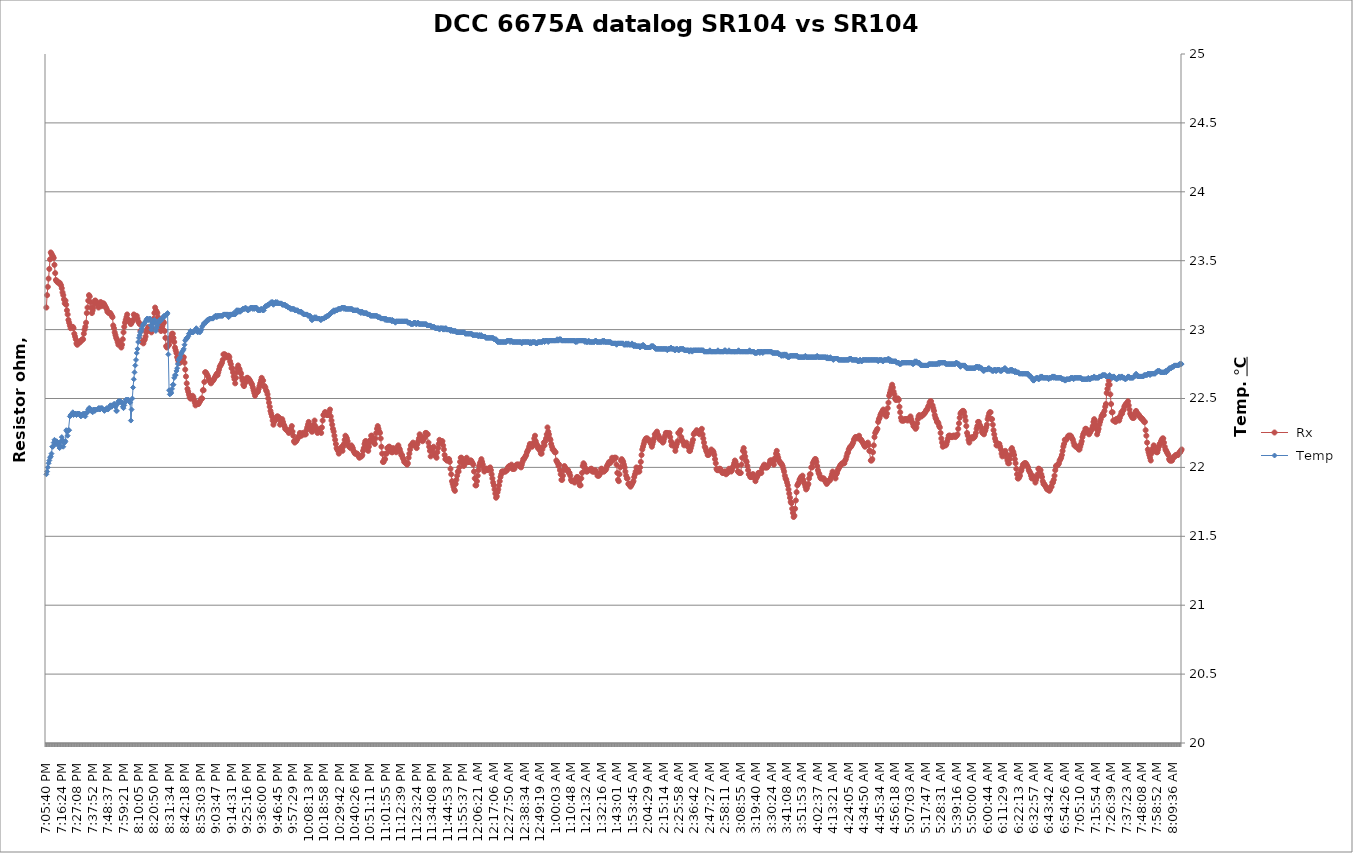
| Category |  Rx |
|---|---|
| 2021-03-24 19:05:40 | 10000.011 |
| 2021-03-24 19:06:10 | 10000.011 |
| 2021-03-24 19:06:41 | 10000.011 |
| 2021-03-24 19:07:12 | 10000.011 |
| 2021-03-24 19:07:42 | 10000.011 |
| 2021-03-24 19:08:13 | 10000.012 |
| 2021-03-24 19:08:44 | 10000.012 |
| 2021-03-24 19:09:14 | 10000.012 |
| 2021-03-24 19:09:45 | 10000.012 |
| 2021-03-24 19:10:16 | 10000.012 |
| 2021-03-24 19:10:46 | 10000.012 |
| 2021-03-24 19:11:17 | 10000.011 |
| 2021-03-24 19:11:48 | 10000.011 |
| 2021-03-24 19:12:18 | 10000.011 |
| 2021-03-24 19:12:49 | 10000.011 |
| 2021-03-24 19:13:20 | 10000.011 |
| 2021-03-24 19:13:51 | 10000.011 |
| 2021-03-24 19:14:21 | 10000.011 |
| 2021-03-24 19:14:52 | 10000.011 |
| 2021-03-24 19:15:23 | 10000.011 |
| 2021-03-24 19:15:53 | 10000.011 |
| 2021-03-24 19:16:24 | 10000.011 |
| 2021-03-24 19:16:55 | 10000.011 |
| 2021-03-24 19:17:25 | 10000.011 |
| 2021-03-24 19:17:56 | 10000.011 |
| 2021-03-24 19:18:27 | 10000.011 |
| 2021-03-24 19:18:57 | 10000.011 |
| 2021-03-24 19:19:28 | 10000.011 |
| 2021-03-24 19:19:59 | 10000.011 |
| 2021-03-24 19:20:29 | 10000.011 |
| 2021-03-24 19:21:00 | 10000.011 |
| 2021-03-24 19:21:31 | 10000.011 |
| 2021-03-24 19:22:01 | 10000.011 |
| 2021-03-24 19:22:32 | 10000.011 |
| 2021-03-24 19:23:03 | 10000.011 |
| 2021-03-24 19:23:33 | 10000.011 |
| 2021-03-24 19:24:04 | 10000.011 |
| 2021-03-24 19:24:35 | 10000.011 |
| 2021-03-24 19:25:05 | 10000.011 |
| 2021-03-24 19:25:36 | 10000.011 |
| 2021-03-24 19:26:07 | 10000.011 |
| 2021-03-24 19:26:37 | 10000.011 |
| 2021-03-24 19:27:08 | 10000.011 |
| 2021-03-24 19:27:39 | 10000.011 |
| 2021-03-24 19:28:10 | 10000.011 |
| 2021-03-24 19:28:40 | 10000.011 |
| 2021-03-24 19:29:11 | 10000.011 |
| 2021-03-24 19:29:42 | 10000.011 |
| 2021-03-24 19:30:12 | 10000.011 |
| 2021-03-24 19:30:43 | 10000.011 |
| 2021-03-24 19:31:14 | 10000.011 |
| 2021-03-24 19:31:44 | 10000.011 |
| 2021-03-24 19:32:15 | 10000.011 |
| 2021-03-24 19:32:46 | 10000.011 |
| 2021-03-24 19:33:16 | 10000.011 |
| 2021-03-24 19:33:47 | 10000.011 |
| 2021-03-24 19:34:18 | 10000.011 |
| 2021-03-24 19:34:48 | 10000.011 |
| 2021-03-24 19:35:19 | 10000.011 |
| 2021-03-24 19:35:50 | 10000.011 |
| 2021-03-24 19:36:20 | 10000.011 |
| 2021-03-24 19:36:51 | 10000.011 |
| 2021-03-24 19:37:22 | 10000.011 |
| 2021-03-24 19:37:52 | 10000.011 |
| 2021-03-24 19:38:23 | 10000.011 |
| 2021-03-24 19:38:54 | 10000.011 |
| 2021-03-24 19:39:24 | 10000.011 |
| 2021-03-24 19:39:55 | 10000.011 |
| 2021-03-24 19:40:26 | 10000.011 |
| 2021-03-24 19:40:57 | 10000.011 |
| 2021-03-24 19:41:27 | 10000.011 |
| 2021-03-24 19:41:58 | 10000.011 |
| 2021-03-24 19:42:29 | 10000.011 |
| 2021-03-24 19:42:59 | 10000.011 |
| 2021-03-24 19:43:30 | 10000.011 |
| 2021-03-24 19:44:01 | 10000.011 |
| 2021-03-24 19:44:31 | 10000.011 |
| 2021-03-24 19:45:02 | 10000.011 |
| 2021-03-24 19:45:33 | 10000.011 |
| 2021-03-24 19:46:03 | 10000.011 |
| 2021-03-24 19:46:34 | 10000.011 |
| 2021-03-24 19:47:05 | 10000.011 |
| 2021-03-24 19:47:35 | 10000.011 |
| 2021-03-24 19:48:06 | 10000.011 |
| 2021-03-24 19:48:37 | 10000.011 |
| 2021-03-24 19:49:07 | 10000.011 |
| 2021-03-24 19:49:38 | 10000.011 |
| 2021-03-24 19:50:09 | 10000.011 |
| 2021-03-24 19:50:39 | 10000.011 |
| 2021-03-24 19:51:10 | 10000.011 |
| 2021-03-24 19:51:41 | 10000.011 |
| 2021-03-24 19:52:11 | 10000.011 |
| 2021-03-24 19:52:42 | 10000.011 |
| 2021-03-24 19:53:13 | 10000.011 |
| 2021-03-24 19:53:44 | 10000.011 |
| 2021-03-24 19:54:14 | 10000.011 |
| 2021-03-24 19:54:45 | 10000.011 |
| 2021-03-24 19:55:16 | 10000.011 |
| 2021-03-24 19:55:46 | 10000.011 |
| 2021-03-24 19:56:17 | 10000.011 |
| 2021-03-24 19:56:48 | 10000.011 |
| 2021-03-24 19:57:18 | 10000.011 |
| 2021-03-24 19:57:49 | 10000.011 |
| 2021-03-24 19:58:20 | 10000.011 |
| 2021-03-24 19:58:50 | 10000.011 |
| 2021-03-24 19:59:21 | 10000.011 |
| 2021-03-24 19:59:52 | 10000.011 |
| 2021-03-24 20:00:22 | 10000.011 |
| 2021-03-24 20:00:53 | 10000.011 |
| 2021-03-24 20:01:24 | 10000.011 |
| 2021-03-24 20:01:54 | 10000.011 |
| 2021-03-24 20:02:25 | 10000.011 |
| 2021-03-24 20:02:56 | 10000.011 |
| 2021-03-24 20:03:26 | 10000.011 |
| 2021-03-24 20:03:57 | 10000.011 |
| 2021-03-24 20:04:28 | 10000.011 |
| 2021-03-24 20:04:58 | 10000.011 |
| 2021-03-24 20:05:29 | 10000.011 |
| 2021-03-24 20:06:00 | 10000.011 |
| 2021-03-24 20:06:30 | 10000.011 |
| 2021-03-24 20:07:01 | 10000.011 |
| 2021-03-24 20:07:32 | 10000.011 |
| 2021-03-24 20:08:03 | 10000.011 |
| 2021-03-24 20:08:33 | 10000.011 |
| 2021-03-24 20:09:04 | 10000.011 |
| 2021-03-24 20:09:35 | 10000.011 |
| 2021-03-24 20:10:05 | 10000.011 |
| 2021-03-24 20:10:36 | 10000.011 |
| 2021-03-24 20:11:07 | 10000.011 |
| 2021-03-24 20:11:37 | 10000.011 |
| 2021-03-24 20:12:08 | 10000.011 |
| 2021-03-24 20:12:39 | 10000.011 |
| 2021-03-24 20:13:09 | 10000.011 |
| 2021-03-24 20:13:40 | 10000.011 |
| 2021-03-24 20:14:11 | 10000.011 |
| 2021-03-24 20:14:41 | 10000.011 |
| 2021-03-24 20:15:12 | 10000.011 |
| 2021-03-24 20:15:43 | 10000.011 |
| 2021-03-24 20:16:13 | 10000.011 |
| 2021-03-24 20:16:44 | 10000.011 |
| 2021-03-24 20:17:15 | 10000.011 |
| 2021-03-24 20:17:45 | 10000.011 |
| 2021-03-24 20:18:16 | 10000.011 |
| 2021-03-24 20:18:47 | 10000.011 |
| 2021-03-24 20:19:18 | 10000.011 |
| 2021-03-24 20:19:48 | 10000.011 |
| 2021-03-24 20:20:19 | 10000.011 |
| 2021-03-24 20:20:50 | 10000.011 |
| 2021-03-24 20:21:20 | 10000.011 |
| 2021-03-24 20:21:51 | 10000.011 |
| 2021-03-24 20:22:22 | 10000.011 |
| 2021-03-24 20:22:52 | 10000.011 |
| 2021-03-24 20:23:23 | 10000.011 |
| 2021-03-24 20:23:54 | 10000.011 |
| 2021-03-24 20:24:24 | 10000.011 |
| 2021-03-24 20:24:55 | 10000.011 |
| 2021-03-24 20:25:26 | 10000.011 |
| 2021-03-24 20:25:56 | 10000.011 |
| 2021-03-24 20:26:27 | 10000.011 |
| 2021-03-24 20:26:58 | 10000.011 |
| 2021-03-24 20:27:29 | 10000.011 |
| 2021-03-24 20:27:59 | 10000.011 |
| 2021-03-24 20:28:30 | 10000.011 |
| 2021-03-24 20:29:01 | 10000.011 |
| 2021-03-24 20:29:31 | 10000.011 |
| 2021-03-24 20:30:02 | 10000.011 |
| 2021-03-24 20:30:33 | 10000.011 |
| 2021-03-24 20:31:03 | 10000.011 |
| 2021-03-24 20:31:34 | 10000.011 |
| 2021-03-24 20:32:05 | 10000.011 |
| 2021-03-24 20:32:35 | 10000.011 |
| 2021-03-24 20:33:06 | 10000.011 |
| 2021-03-24 20:33:37 | 10000.011 |
| 2021-03-24 20:34:07 | 10000.011 |
| 2021-03-24 20:34:38 | 10000.011 |
| 2021-03-24 20:35:09 | 10000.011 |
| 2021-03-24 20:35:39 | 10000.011 |
| 2021-03-24 20:36:10 | 10000.011 |
| 2021-03-24 20:36:41 | 10000.011 |
| 2021-03-24 20:37:11 | 10000.011 |
| 2021-03-24 20:37:42 | 10000.011 |
| 2021-03-24 20:38:13 | 10000.011 |
| 2021-03-24 20:38:44 | 10000.011 |
| 2021-03-24 20:39:14 | 10000.011 |
| 2021-03-24 20:39:45 | 10000.011 |
| 2021-03-24 20:40:16 | 10000.011 |
| 2021-03-24 20:40:46 | 10000.011 |
| 2021-03-24 20:41:17 | 10000.011 |
| 2021-03-24 20:41:48 | 10000.011 |
| 2021-03-24 20:42:18 | 10000.011 |
| 2021-03-24 20:42:49 | 10000.011 |
| 2021-03-24 20:43:20 | 10000.011 |
| 2021-03-24 20:43:50 | 10000.011 |
| 2021-03-24 20:44:21 | 10000.011 |
| 2021-03-24 20:44:52 | 10000.011 |
| 2021-03-24 20:45:22 | 10000.011 |
| 2021-03-24 20:45:53 | 10000.01 |
| 2021-03-24 20:46:24 | 10000.01 |
| 2021-03-24 20:46:55 | 10000.011 |
| 2021-03-24 20:47:25 | 10000.011 |
| 2021-03-24 20:47:56 | 10000.011 |
| 2021-03-24 20:48:27 | 10000.01 |
| 2021-03-24 20:48:57 | 10000.01 |
| 2021-03-24 20:49:28 | 10000.01 |
| 2021-03-24 20:49:59 | 10000.01 |
| 2021-03-24 20:50:29 | 10000.01 |
| 2021-03-24 20:51:00 | 10000.01 |
| 2021-03-24 20:51:31 | 10000.01 |
| 2021-03-24 20:52:01 | 10000.01 |
| 2021-03-24 20:52:32 | 10000.01 |
| 2021-03-24 20:53:03 | 10000.01 |
| 2021-03-24 20:53:33 | 10000.01 |
| 2021-03-24 20:54:04 | 10000.01 |
| 2021-03-24 20:54:35 | 10000.011 |
| 2021-03-24 20:55:05 | 10000.011 |
| 2021-03-24 20:55:36 | 10000.011 |
| 2021-03-24 20:56:07 | 10000.011 |
| 2021-03-24 20:56:38 | 10000.011 |
| 2021-03-24 20:57:08 | 10000.011 |
| 2021-03-24 20:57:39 | 10000.011 |
| 2021-03-24 20:58:10 | 10000.011 |
| 2021-03-24 20:58:40 | 10000.011 |
| 2021-03-24 20:59:11 | 10000.011 |
| 2021-03-24 20:59:42 | 10000.011 |
| 2021-03-24 21:00:12 | 10000.011 |
| 2021-03-24 21:00:43 | 10000.011 |
| 2021-03-24 21:01:14 | 10000.011 |
| 2021-03-24 21:01:44 | 10000.011 |
| 2021-03-24 21:02:15 | 10000.011 |
| 2021-03-24 21:02:46 | 10000.011 |
| 2021-03-24 21:03:16 | 10000.011 |
| 2021-03-24 21:03:47 | 10000.011 |
| 2021-03-24 21:04:18 | 10000.011 |
| 2021-03-24 21:04:48 | 10000.011 |
| 2021-03-24 21:05:19 | 10000.011 |
| 2021-03-24 21:05:50 | 10000.011 |
| 2021-03-24 21:06:20 | 10000.011 |
| 2021-03-24 21:06:51 | 10000.011 |
| 2021-03-24 21:07:22 | 10000.011 |
| 2021-03-24 21:07:53 | 10000.011 |
| 2021-03-24 21:08:23 | 10000.011 |
| 2021-03-24 21:08:54 | 10000.011 |
| 2021-03-24 21:09:25 | 10000.011 |
| 2021-03-24 21:09:55 | 10000.011 |
| 2021-03-24 21:10:26 | 10000.011 |
| 2021-03-24 21:10:57 | 10000.011 |
| 2021-03-24 21:11:27 | 10000.011 |
| 2021-03-24 21:11:58 | 10000.011 |
| 2021-03-24 21:12:29 | 10000.011 |
| 2021-03-24 21:12:59 | 10000.011 |
| 2021-03-24 21:13:30 | 10000.011 |
| 2021-03-24 21:14:01 | 10000.011 |
| 2021-03-24 21:14:31 | 10000.011 |
| 2021-03-24 21:15:02 | 10000.011 |
| 2021-03-24 21:15:33 | 10000.011 |
| 2021-03-24 21:16:03 | 10000.011 |
| 2021-03-24 21:16:34 | 10000.011 |
| 2021-03-24 21:17:05 | 10000.011 |
| 2021-03-24 21:17:36 | 10000.011 |
| 2021-03-24 21:18:06 | 10000.011 |
| 2021-03-24 21:18:37 | 10000.011 |
| 2021-03-24 21:19:08 | 10000.011 |
| 2021-03-24 21:19:38 | 10000.011 |
| 2021-03-24 21:20:09 | 10000.011 |
| 2021-03-24 21:20:40 | 10000.011 |
| 2021-03-24 21:21:10 | 10000.011 |
| 2021-03-24 21:21:41 | 10000.011 |
| 2021-03-24 21:22:12 | 10000.011 |
| 2021-03-24 21:22:42 | 10000.011 |
| 2021-03-24 21:23:13 | 10000.011 |
| 2021-03-24 21:23:44 | 10000.011 |
| 2021-03-24 21:24:14 | 10000.011 |
| 2021-03-24 21:24:45 | 10000.011 |
| 2021-03-24 21:25:16 | 10000.011 |
| 2021-03-24 21:25:46 | 10000.011 |
| 2021-03-24 21:26:17 | 10000.011 |
| 2021-03-24 21:26:48 | 10000.011 |
| 2021-03-24 21:27:19 | 10000.011 |
| 2021-03-24 21:27:49 | 10000.011 |
| 2021-03-24 21:28:20 | 10000.011 |
| 2021-03-24 21:28:51 | 10000.011 |
| 2021-03-24 21:29:21 | 10000.011 |
| 2021-03-24 21:29:52 | 10000.011 |
| 2021-03-24 21:30:23 | 10000.011 |
| 2021-03-24 21:30:53 | 10000.011 |
| 2021-03-24 21:31:24 | 10000.011 |
| 2021-03-24 21:31:55 | 10000.011 |
| 2021-03-24 21:32:25 | 10000.011 |
| 2021-03-24 21:32:56 | 10000.011 |
| 2021-03-24 21:33:27 | 10000.011 |
| 2021-03-24 21:33:57 | 10000.011 |
| 2021-03-24 21:34:28 | 10000.011 |
| 2021-03-24 21:34:59 | 10000.011 |
| 2021-03-24 21:35:29 | 10000.011 |
| 2021-03-24 21:36:00 | 10000.011 |
| 2021-03-24 21:36:31 | 10000.011 |
| 2021-03-24 21:37:02 | 10000.011 |
| 2021-03-24 21:37:32 | 10000.011 |
| 2021-03-24 21:38:03 | 10000.011 |
| 2021-03-24 21:38:34 | 10000.011 |
| 2021-03-24 21:39:04 | 10000.011 |
| 2021-03-24 21:39:35 | 10000.011 |
| 2021-03-24 21:40:06 | 10000.01 |
| 2021-03-24 21:40:36 | 10000.01 |
| 2021-03-24 21:41:07 | 10000.01 |
| 2021-03-24 21:41:38 | 10000.01 |
| 2021-03-24 21:42:08 | 10000.01 |
| 2021-03-24 21:42:39 | 10000.01 |
| 2021-03-24 21:43:10 | 10000.01 |
| 2021-03-24 21:43:40 | 10000.01 |
| 2021-03-24 21:44:11 | 10000.01 |
| 2021-03-24 21:44:42 | 10000.01 |
| 2021-03-24 21:45:13 | 10000.01 |
| 2021-03-24 21:45:43 | 10000.01 |
| 2021-03-24 21:46:14 | 10000.01 |
| 2021-03-24 21:46:45 | 10000.01 |
| 2021-03-24 21:47:15 | 10000.01 |
| 2021-03-24 21:47:46 | 10000.01 |
| 2021-03-24 21:48:17 | 10000.01 |
| 2021-03-24 21:48:47 | 10000.01 |
| 2021-03-24 21:49:18 | 10000.01 |
| 2021-03-24 21:49:49 | 10000.01 |
| 2021-03-24 21:50:19 | 10000.01 |
| 2021-03-24 21:50:50 | 10000.01 |
| 2021-03-24 21:51:21 | 10000.01 |
| 2021-03-24 21:51:51 | 10000.01 |
| 2021-03-24 21:52:22 | 10000.01 |
| 2021-03-24 21:52:53 | 10000.01 |
| 2021-03-24 21:53:23 | 10000.01 |
| 2021-03-24 21:53:54 | 10000.01 |
| 2021-03-24 21:54:25 | 10000.01 |
| 2021-03-24 21:54:56 | 10000.01 |
| 2021-03-24 21:55:26 | 10000.01 |
| 2021-03-24 21:55:57 | 10000.01 |
| 2021-03-24 21:56:28 | 10000.01 |
| 2021-03-24 21:56:58 | 10000.01 |
| 2021-03-24 21:57:29 | 10000.01 |
| 2021-03-24 21:58:00 | 10000.01 |
| 2021-03-24 21:58:30 | 10000.01 |
| 2021-03-24 21:59:01 | 10000.01 |
| 2021-03-24 21:59:32 | 10000.01 |
| 2021-03-24 22:00:02 | 10000.01 |
| 2021-03-24 22:00:33 | 10000.01 |
| 2021-03-24 22:01:04 | 10000.01 |
| 2021-03-24 22:01:34 | 10000.01 |
| 2021-03-24 22:02:05 | 10000.01 |
| 2021-03-24 22:02:36 | 10000.01 |
| 2021-03-24 22:03:06 | 10000.01 |
| 2021-03-24 22:03:37 | 10000.01 |
| 2021-03-24 22:04:08 | 10000.01 |
| 2021-03-24 22:04:38 | 10000.01 |
| 2021-03-24 22:05:09 | 10000.01 |
| 2021-03-24 22:05:40 | 10000.01 |
| 2021-03-24 22:06:11 | 10000.01 |
| 2021-03-24 22:06:41 | 10000.01 |
| 2021-03-24 22:07:12 | 10000.01 |
| 2021-03-24 22:07:43 | 10000.01 |
| 2021-03-24 22:08:13 | 10000.01 |
| 2021-03-24 22:08:44 | 10000.01 |
| 2021-03-24 22:09:15 | 10000.01 |
| 2021-03-24 22:09:45 | 10000.01 |
| 2021-03-24 22:10:16 | 10000.01 |
| 2021-03-24 22:10:47 | 10000.01 |
| 2021-03-24 22:11:17 | 10000.01 |
| 2021-03-24 22:11:48 | 10000.01 |
| 2021-03-24 22:12:19 | 10000.01 |
| 2021-03-24 22:12:49 | 10000.01 |
| 2021-03-24 22:13:20 | 10000.01 |
| 2021-03-24 22:13:51 | 10000.01 |
| 2021-03-24 22:14:21 | 10000.01 |
| 2021-03-24 22:14:52 | 10000.01 |
| 2021-03-24 22:15:23 | 10000.01 |
| 2021-03-24 22:15:54 | 10000.01 |
| 2021-03-24 22:16:24 | 10000.01 |
| 2021-03-24 22:16:55 | 10000.01 |
| 2021-03-24 22:17:26 | 10000.01 |
| 2021-03-24 22:17:56 | 10000.01 |
| 2021-03-24 22:18:27 | 10000.01 |
| 2021-03-24 22:18:58 | 10000.01 |
| 2021-03-24 22:19:28 | 10000.01 |
| 2021-03-24 22:19:59 | 10000.01 |
| 2021-03-24 22:20:30 | 10000.01 |
| 2021-03-24 22:21:00 | 10000.01 |
| 2021-03-24 22:21:31 | 10000.01 |
| 2021-03-24 22:22:02 | 10000.01 |
| 2021-03-24 22:22:32 | 10000.01 |
| 2021-03-24 22:23:03 | 10000.01 |
| 2021-03-24 22:23:34 | 10000.01 |
| 2021-03-24 22:24:04 | 10000.01 |
| 2021-03-24 22:24:35 | 10000.01 |
| 2021-03-24 22:25:06 | 10000.01 |
| 2021-03-24 22:25:36 | 10000.01 |
| 2021-03-24 22:26:07 | 10000.01 |
| 2021-03-24 22:26:38 | 10000.01 |
| 2021-03-24 22:27:09 | 10000.01 |
| 2021-03-24 22:27:39 | 10000.01 |
| 2021-03-24 22:28:10 | 10000.01 |
| 2021-03-24 22:28:41 | 10000.01 |
| 2021-03-24 22:29:11 | 10000.01 |
| 2021-03-24 22:29:42 | 10000.01 |
| 2021-03-24 22:30:13 | 10000.01 |
| 2021-03-24 22:30:43 | 10000.01 |
| 2021-03-24 22:31:14 | 10000.01 |
| 2021-03-24 22:31:45 | 10000.01 |
| 2021-03-24 22:32:15 | 10000.01 |
| 2021-03-24 22:32:46 | 10000.01 |
| 2021-03-24 22:33:17 | 10000.01 |
| 2021-03-24 22:33:47 | 10000.01 |
| 2021-03-24 22:34:18 | 10000.01 |
| 2021-03-24 22:34:49 | 10000.01 |
| 2021-03-24 22:35:20 | 10000.01 |
| 2021-03-24 22:35:50 | 10000.01 |
| 2021-03-24 22:36:21 | 10000.01 |
| 2021-03-24 22:36:52 | 10000.01 |
| 2021-03-24 22:37:22 | 10000.01 |
| 2021-03-24 22:37:53 | 10000.01 |
| 2021-03-24 22:38:24 | 10000.01 |
| 2021-03-24 22:38:54 | 10000.01 |
| 2021-03-24 22:39:25 | 10000.01 |
| 2021-03-24 22:39:56 | 10000.01 |
| 2021-03-24 22:40:26 | 10000.01 |
| 2021-03-24 22:40:57 | 10000.01 |
| 2021-03-24 22:41:28 | 10000.01 |
| 2021-03-24 22:41:58 | 10000.01 |
| 2021-03-24 22:42:29 | 10000.01 |
| 2021-03-24 22:43:00 | 10000.01 |
| 2021-03-24 22:43:30 | 10000.01 |
| 2021-03-24 22:44:01 | 10000.01 |
| 2021-03-24 22:44:32 | 10000.01 |
| 2021-03-24 22:45:03 | 10000.01 |
| 2021-03-24 22:45:33 | 10000.01 |
| 2021-03-24 22:46:04 | 10000.01 |
| 2021-03-24 22:46:35 | 10000.01 |
| 2021-03-24 22:47:05 | 10000.01 |
| 2021-03-24 22:47:36 | 10000.01 |
| 2021-03-24 22:48:07 | 10000.01 |
| 2021-03-24 22:48:37 | 10000.01 |
| 2021-03-24 22:49:08 | 10000.01 |
| 2021-03-24 22:49:39 | 10000.01 |
| 2021-03-24 22:50:09 | 10000.01 |
| 2021-03-24 22:50:40 | 10000.01 |
| 2021-03-24 22:51:11 | 10000.01 |
| 2021-03-24 22:51:41 | 10000.01 |
| 2021-03-24 22:52:12 | 10000.01 |
| 2021-03-24 22:52:43 | 10000.01 |
| 2021-03-24 22:53:13 | 10000.01 |
| 2021-03-24 22:53:44 | 10000.01 |
| 2021-03-24 22:54:15 | 10000.01 |
| 2021-03-24 22:54:46 | 10000.01 |
| 2021-03-24 22:55:16 | 10000.01 |
| 2021-03-24 22:55:47 | 10000.01 |
| 2021-03-24 22:56:18 | 10000.01 |
| 2021-03-24 22:56:48 | 10000.01 |
| 2021-03-24 22:57:19 | 10000.01 |
| 2021-03-24 22:57:50 | 10000.01 |
| 2021-03-24 22:58:20 | 10000.01 |
| 2021-03-24 22:58:51 | 10000.01 |
| 2021-03-24 22:59:22 | 10000.01 |
| 2021-03-24 22:59:52 | 10000.01 |
| 2021-03-24 23:00:23 | 10000.01 |
| 2021-03-24 23:00:54 | 10000.01 |
| 2021-03-24 23:01:24 | 10000.01 |
| 2021-03-24 23:01:55 | 10000.01 |
| 2021-03-24 23:02:26 | 10000.01 |
| 2021-03-24 23:02:56 | 10000.01 |
| 2021-03-24 23:03:27 | 10000.01 |
| 2021-03-24 23:03:58 | 10000.01 |
| 2021-03-24 23:04:29 | 10000.01 |
| 2021-03-24 23:04:59 | 10000.01 |
| 2021-03-24 23:05:30 | 10000.01 |
| 2021-03-24 23:06:01 | 10000.01 |
| 2021-03-24 23:06:31 | 10000.01 |
| 2021-03-24 23:07:02 | 10000.01 |
| 2021-03-24 23:07:33 | 10000.01 |
| 2021-03-24 23:08:03 | 10000.01 |
| 2021-03-24 23:08:34 | 10000.01 |
| 2021-03-24 23:09:05 | 10000.01 |
| 2021-03-24 23:09:35 | 10000.01 |
| 2021-03-24 23:10:06 | 10000.01 |
| 2021-03-24 23:10:37 | 10000.01 |
| 2021-03-24 23:11:07 | 10000.01 |
| 2021-03-24 23:11:38 | 10000.01 |
| 2021-03-24 23:12:09 | 10000.01 |
| 2021-03-24 23:12:39 | 10000.01 |
| 2021-03-24 23:13:10 | 10000.01 |
| 2021-03-24 23:13:41 | 10000.01 |
| 2021-03-24 23:14:12 | 10000.01 |
| 2021-03-24 23:14:42 | 10000.01 |
| 2021-03-24 23:15:13 | 10000.01 |
| 2021-03-24 23:15:44 | 10000.01 |
| 2021-03-24 23:16:14 | 10000.01 |
| 2021-03-24 23:16:45 | 10000.01 |
| 2021-03-24 23:17:16 | 10000.01 |
| 2021-03-24 23:17:46 | 10000.01 |
| 2021-03-24 23:18:17 | 10000.01 |
| 2021-03-24 23:18:48 | 10000.01 |
| 2021-03-24 23:19:18 | 10000.01 |
| 2021-03-24 23:19:49 | 10000.01 |
| 2021-03-24 23:20:20 | 10000.01 |
| 2021-03-24 23:20:50 | 10000.01 |
| 2021-03-24 23:21:21 | 10000.01 |
| 2021-03-24 23:21:52 | 10000.01 |
| 2021-03-24 23:22:22 | 10000.01 |
| 2021-03-24 23:22:53 | 10000.01 |
| 2021-03-24 23:23:24 | 10000.01 |
| 2021-03-24 23:23:55 | 10000.01 |
| 2021-03-24 23:24:25 | 10000.01 |
| 2021-03-24 23:24:56 | 10000.01 |
| 2021-03-24 23:25:27 | 10000.01 |
| 2021-03-24 23:25:57 | 10000.01 |
| 2021-03-24 23:26:28 | 10000.01 |
| 2021-03-24 23:26:59 | 10000.01 |
| 2021-03-24 23:27:29 | 10000.01 |
| 2021-03-24 23:28:00 | 10000.01 |
| 2021-03-24 23:28:31 | 10000.01 |
| 2021-03-24 23:29:01 | 10000.01 |
| 2021-03-24 23:29:32 | 10000.01 |
| 2021-03-24 23:30:03 | 10000.01 |
| 2021-03-24 23:30:33 | 10000.01 |
| 2021-03-24 23:31:04 | 10000.01 |
| 2021-03-24 23:31:35 | 10000.01 |
| 2021-03-24 23:32:05 | 10000.01 |
| 2021-03-24 23:32:36 | 10000.01 |
| 2021-03-24 23:33:07 | 10000.01 |
| 2021-03-24 23:33:38 | 10000.01 |
| 2021-03-24 23:34:08 | 10000.01 |
| 2021-03-24 23:34:39 | 10000.01 |
| 2021-03-24 23:35:10 | 10000.01 |
| 2021-03-24 23:35:40 | 10000.01 |
| 2021-03-24 23:36:11 | 10000.01 |
| 2021-03-24 23:36:42 | 10000.01 |
| 2021-03-24 23:37:12 | 10000.01 |
| 2021-03-24 23:37:43 | 10000.01 |
| 2021-03-24 23:38:14 | 10000.01 |
| 2021-03-24 23:38:44 | 10000.01 |
| 2021-03-24 23:39:15 | 10000.01 |
| 2021-03-24 23:39:46 | 10000.01 |
| 2021-03-24 23:40:16 | 10000.01 |
| 2021-03-24 23:40:47 | 10000.01 |
| 2021-03-24 23:41:18 | 10000.01 |
| 2021-03-24 23:41:48 | 10000.01 |
| 2021-03-24 23:42:19 | 10000.01 |
| 2021-03-24 23:42:50 | 10000.01 |
| 2021-03-24 23:43:21 | 10000.01 |
| 2021-03-24 23:43:51 | 10000.01 |
| 2021-03-24 23:44:22 | 10000.01 |
| 2021-03-24 23:44:53 | 10000.01 |
| 2021-03-24 23:45:23 | 10000.01 |
| 2021-03-24 23:45:54 | 10000.01 |
| 2021-03-24 23:46:25 | 10000.01 |
| 2021-03-24 23:46:55 | 10000.01 |
| 2021-03-24 23:47:26 | 10000.01 |
| 2021-03-24 23:47:57 | 10000.01 |
| 2021-03-24 23:48:27 | 10000.01 |
| 2021-03-24 23:48:58 | 10000.01 |
| 2021-03-24 23:49:29 | 10000.01 |
| 2021-03-24 23:49:59 | 10000.01 |
| 2021-03-24 23:50:30 | 10000.01 |
| 2021-03-24 23:51:01 | 10000.01 |
| 2021-03-24 23:51:31 | 10000.01 |
| 2021-03-24 23:52:02 | 10000.01 |
| 2021-03-24 23:52:33 | 10000.01 |
| 2021-03-24 23:53:04 | 10000.01 |
| 2021-03-24 23:53:34 | 10000.01 |
| 2021-03-24 23:54:05 | 10000.01 |
| 2021-03-24 23:54:36 | 10000.01 |
| 2021-03-24 23:55:06 | 10000.01 |
| 2021-03-24 23:55:37 | 10000.01 |
| 2021-03-24 23:56:08 | 10000.01 |
| 2021-03-24 23:56:38 | 10000.01 |
| 2021-03-24 23:57:09 | 10000.01 |
| 2021-03-24 23:57:40 | 10000.01 |
| 2021-03-24 23:58:10 | 10000.01 |
| 2021-03-24 23:58:41 | 10000.01 |
| 2021-03-24 23:59:12 | 10000.01 |
| 2021-03-24 23:59:42 | 10000.01 |
| 2021-03-25 00:00:13 | 10000.01 |
| 2021-03-25 00:00:44 | 10000.01 |
| 2021-03-25 00:01:15 | 10000.01 |
| 2021-03-25 00:01:45 | 10000.01 |
| 2021-03-25 00:02:16 | 10000.01 |
| 2021-03-25 00:02:47 | 10000.01 |
| 2021-03-25 00:03:17 | 10000.01 |
| 2021-03-25 00:03:48 | 10000.01 |
| 2021-03-25 00:04:19 | 10000.01 |
| 2021-03-25 00:04:49 | 10000.01 |
| 2021-03-25 00:05:20 | 10000.01 |
| 2021-03-25 00:05:51 | 10000.01 |
| 2021-03-25 00:06:21 | 10000.01 |
| 2021-03-25 00:06:52 | 10000.01 |
| 2021-03-25 00:07:23 | 10000.01 |
| 2021-03-25 00:07:53 | 10000.01 |
| 2021-03-25 00:08:24 | 10000.01 |
| 2021-03-25 00:08:55 | 10000.01 |
| 2021-03-25 00:09:25 | 10000.01 |
| 2021-03-25 00:09:56 | 10000.01 |
| 2021-03-25 00:10:27 | 10000.01 |
| 2021-03-25 00:10:57 | 10000.01 |
| 2021-03-25 00:11:28 | 10000.01 |
| 2021-03-25 00:11:59 | 10000.01 |
| 2021-03-25 00:12:30 | 10000.01 |
| 2021-03-25 00:13:00 | 10000.01 |
| 2021-03-25 00:13:31 | 10000.01 |
| 2021-03-25 00:14:02 | 10000.01 |
| 2021-03-25 00:14:32 | 10000.01 |
| 2021-03-25 00:15:03 | 10000.01 |
| 2021-03-25 00:15:34 | 10000.01 |
| 2021-03-25 00:16:04 | 10000.01 |
| 2021-03-25 00:16:35 | 10000.01 |
| 2021-03-25 00:17:06 | 10000.01 |
| 2021-03-25 00:17:36 | 10000.01 |
| 2021-03-25 00:18:07 | 10000.01 |
| 2021-03-25 00:18:38 | 10000.01 |
| 2021-03-25 00:19:08 | 10000.01 |
| 2021-03-25 00:19:39 | 10000.01 |
| 2021-03-25 00:20:10 | 10000.01 |
| 2021-03-25 00:20:40 | 10000.01 |
| 2021-03-25 00:21:11 | 10000.01 |
| 2021-03-25 00:21:42 | 10000.01 |
| 2021-03-25 00:22:12 | 10000.01 |
| 2021-03-25 00:22:43 | 10000.01 |
| 2021-03-25 00:23:14 | 10000.01 |
| 2021-03-25 00:23:45 | 10000.01 |
| 2021-03-25 00:24:15 | 10000.01 |
| 2021-03-25 00:24:46 | 10000.01 |
| 2021-03-25 00:25:17 | 10000.01 |
| 2021-03-25 00:25:47 | 10000.01 |
| 2021-03-25 00:26:18 | 10000.01 |
| 2021-03-25 00:26:49 | 10000.01 |
| 2021-03-25 00:27:19 | 10000.01 |
| 2021-03-25 00:27:50 | 10000.01 |
| 2021-03-25 00:28:21 | 10000.01 |
| 2021-03-25 00:28:51 | 10000.01 |
| 2021-03-25 00:29:22 | 10000.01 |
| 2021-03-25 00:29:53 | 10000.01 |
| 2021-03-25 00:30:23 | 10000.01 |
| 2021-03-25 00:30:54 | 10000.01 |
| 2021-03-25 00:31:25 | 10000.01 |
| 2021-03-25 00:31:56 | 10000.01 |
| 2021-03-25 00:32:26 | 10000.01 |
| 2021-03-25 00:32:57 | 10000.01 |
| 2021-03-25 00:33:28 | 10000.01 |
| 2021-03-25 00:33:58 | 10000.01 |
| 2021-03-25 00:34:29 | 10000.01 |
| 2021-03-25 00:35:00 | 10000.01 |
| 2021-03-25 00:35:30 | 10000.01 |
| 2021-03-25 00:36:01 | 10000.01 |
| 2021-03-25 00:36:32 | 10000.01 |
| 2021-03-25 00:37:02 | 10000.01 |
| 2021-03-25 00:37:33 | 10000.01 |
| 2021-03-25 00:38:04 | 10000.01 |
| 2021-03-25 00:38:34 | 10000.01 |
| 2021-03-25 00:39:05 | 10000.01 |
| 2021-03-25 00:39:36 | 10000.01 |
| 2021-03-25 00:40:06 | 10000.01 |
| 2021-03-25 00:40:37 | 10000.01 |
| 2021-03-25 00:41:08 | 10000.01 |
| 2021-03-25 00:41:39 | 10000.01 |
| 2021-03-25 00:42:09 | 10000.01 |
| 2021-03-25 00:42:40 | 10000.01 |
| 2021-03-25 00:43:11 | 10000.01 |
| 2021-03-25 00:43:41 | 10000.01 |
| 2021-03-25 00:44:12 | 10000.01 |
| 2021-03-25 00:44:43 | 10000.01 |
| 2021-03-25 00:45:13 | 10000.01 |
| 2021-03-25 00:45:44 | 10000.01 |
| 2021-03-25 00:46:15 | 10000.01 |
| 2021-03-25 00:46:45 | 10000.01 |
| 2021-03-25 00:47:16 | 10000.01 |
| 2021-03-25 00:47:47 | 10000.01 |
| 2021-03-25 00:48:17 | 10000.01 |
| 2021-03-25 00:48:48 | 10000.01 |
| 2021-03-25 00:49:19 | 10000.01 |
| 2021-03-25 00:49:49 | 10000.01 |
| 2021-03-25 00:50:20 | 10000.01 |
| 2021-03-25 00:50:51 | 10000.01 |
| 2021-03-25 00:51:22 | 10000.01 |
| 2021-03-25 00:51:52 | 10000.01 |
| 2021-03-25 00:52:23 | 10000.01 |
| 2021-03-25 00:52:54 | 10000.01 |
| 2021-03-25 00:53:24 | 10000.01 |
| 2021-03-25 00:53:55 | 10000.01 |
| 2021-03-25 00:54:26 | 10000.01 |
| 2021-03-25 00:54:56 | 10000.01 |
| 2021-03-25 00:55:27 | 10000.01 |
| 2021-03-25 00:55:58 | 10000.01 |
| 2021-03-25 00:56:28 | 10000.01 |
| 2021-03-25 00:56:59 | 10000.01 |
| 2021-03-25 00:57:30 | 10000.01 |
| 2021-03-25 00:58:00 | 10000.01 |
| 2021-03-25 00:58:31 | 10000.01 |
| 2021-03-25 00:59:02 | 10000.01 |
| 2021-03-25 00:59:32 | 10000.01 |
| 2021-03-25 01:00:03 | 10000.01 |
| 2021-03-25 01:00:34 | 10000.01 |
| 2021-03-25 01:01:05 | 10000.01 |
| 2021-03-25 01:01:35 | 10000.01 |
| 2021-03-25 01:02:06 | 10000.01 |
| 2021-03-25 01:02:37 | 10000.01 |
| 2021-03-25 01:03:07 | 10000.01 |
| 2021-03-25 01:03:38 | 10000.01 |
| 2021-03-25 01:04:09 | 10000.01 |
| 2021-03-25 01:04:39 | 10000.01 |
| 2021-03-25 01:05:10 | 10000.01 |
| 2021-03-25 01:05:41 | 10000.01 |
| 2021-03-25 01:06:11 | 10000.01 |
| 2021-03-25 01:06:42 | 10000.01 |
| 2021-03-25 01:07:13 | 10000.01 |
| 2021-03-25 01:07:43 | 10000.01 |
| 2021-03-25 01:08:14 | 10000.01 |
| 2021-03-25 01:08:45 | 10000.01 |
| 2021-03-25 01:09:15 | 10000.01 |
| 2021-03-25 01:09:46 | 10000.01 |
| 2021-03-25 01:10:17 | 10000.01 |
| 2021-03-25 01:10:48 | 10000.01 |
| 2021-03-25 01:11:18 | 10000.01 |
| 2021-03-25 01:11:49 | 10000.01 |
| 2021-03-25 01:12:20 | 10000.01 |
| 2021-03-25 01:12:50 | 10000.01 |
| 2021-03-25 01:13:21 | 10000.01 |
| 2021-03-25 01:13:52 | 10000.01 |
| 2021-03-25 01:14:22 | 10000.01 |
| 2021-03-25 01:14:53 | 10000.01 |
| 2021-03-25 01:15:24 | 10000.01 |
| 2021-03-25 01:15:54 | 10000.01 |
| 2021-03-25 01:16:25 | 10000.01 |
| 2021-03-25 01:16:56 | 10000.01 |
| 2021-03-25 01:17:26 | 10000.01 |
| 2021-03-25 01:17:57 | 10000.01 |
| 2021-03-25 01:18:28 | 10000.01 |
| 2021-03-25 01:18:58 | 10000.01 |
| 2021-03-25 01:19:29 | 10000.01 |
| 2021-03-25 01:20:00 | 10000.01 |
| 2021-03-25 01:20:30 | 10000.01 |
| 2021-03-25 01:21:01 | 10000.01 |
| 2021-03-25 01:21:32 | 10000.01 |
| 2021-03-25 01:22:03 | 10000.01 |
| 2021-03-25 01:22:33 | 10000.01 |
| 2021-03-25 01:23:04 | 10000.01 |
| 2021-03-25 01:23:35 | 10000.01 |
| 2021-03-25 01:24:05 | 10000.01 |
| 2021-03-25 01:24:36 | 10000.01 |
| 2021-03-25 01:25:07 | 10000.01 |
| 2021-03-25 01:25:37 | 10000.01 |
| 2021-03-25 01:26:08 | 10000.01 |
| 2021-03-25 01:26:39 | 10000.01 |
| 2021-03-25 01:27:09 | 10000.01 |
| 2021-03-25 01:27:40 | 10000.01 |
| 2021-03-25 01:28:11 | 10000.01 |
| 2021-03-25 01:28:41 | 10000.01 |
| 2021-03-25 01:29:12 | 10000.01 |
| 2021-03-25 01:29:43 | 10000.01 |
| 2021-03-25 01:30:13 | 10000.01 |
| 2021-03-25 01:30:44 | 10000.01 |
| 2021-03-25 01:31:15 | 10000.01 |
| 2021-03-25 01:31:45 | 10000.01 |
| 2021-03-25 01:32:16 | 10000.01 |
| 2021-03-25 01:32:47 | 10000.01 |
| 2021-03-25 01:33:18 | 10000.01 |
| 2021-03-25 01:33:48 | 10000.01 |
| 2021-03-25 01:34:19 | 10000.01 |
| 2021-03-25 01:34:50 | 10000.01 |
| 2021-03-25 01:35:20 | 10000.01 |
| 2021-03-25 01:35:51 | 10000.01 |
| 2021-03-25 01:36:22 | 10000.01 |
| 2021-03-25 01:36:52 | 10000.01 |
| 2021-03-25 01:37:23 | 10000.01 |
| 2021-03-25 01:37:54 | 10000.01 |
| 2021-03-25 01:38:24 | 10000.01 |
| 2021-03-25 01:38:55 | 10000.01 |
| 2021-03-25 01:39:26 | 10000.01 |
| 2021-03-25 01:39:56 | 10000.01 |
| 2021-03-25 01:40:27 | 10000.01 |
| 2021-03-25 01:40:58 | 10000.01 |
| 2021-03-25 01:41:28 | 10000.01 |
| 2021-03-25 01:41:59 | 10000.01 |
| 2021-03-25 01:42:30 | 10000.01 |
| 2021-03-25 01:43:01 | 10000.01 |
| 2021-03-25 01:43:31 | 10000.01 |
| 2021-03-25 01:44:02 | 10000.01 |
| 2021-03-25 01:44:33 | 10000.01 |
| 2021-03-25 01:45:03 | 10000.01 |
| 2021-03-25 01:45:34 | 10000.01 |
| 2021-03-25 01:46:05 | 10000.01 |
| 2021-03-25 01:46:35 | 10000.01 |
| 2021-03-25 01:47:06 | 10000.01 |
| 2021-03-25 01:47:37 | 10000.01 |
| 2021-03-25 01:48:07 | 10000.01 |
| 2021-03-25 01:48:38 | 10000.01 |
| 2021-03-25 01:49:09 | 10000.01 |
| 2021-03-25 01:49:39 | 10000.01 |
| 2021-03-25 01:50:10 | 10000.01 |
| 2021-03-25 01:50:41 | 10000.01 |
| 2021-03-25 01:51:11 | 10000.01 |
| 2021-03-25 01:51:42 | 10000.01 |
| 2021-03-25 01:52:13 | 10000.01 |
| 2021-03-25 01:52:44 | 10000.01 |
| 2021-03-25 01:53:14 | 10000.01 |
| 2021-03-25 01:53:45 | 10000.01 |
| 2021-03-25 01:54:16 | 10000.01 |
| 2021-03-25 01:54:46 | 10000.01 |
| 2021-03-25 01:55:17 | 10000.01 |
| 2021-03-25 01:55:48 | 10000.01 |
| 2021-03-25 01:56:18 | 10000.01 |
| 2021-03-25 01:56:49 | 10000.01 |
| 2021-03-25 01:57:20 | 10000.01 |
| 2021-03-25 01:57:50 | 10000.01 |
| 2021-03-25 01:58:21 | 10000.01 |
| 2021-03-25 01:58:52 | 10000.01 |
| 2021-03-25 01:59:22 | 10000.01 |
| 2021-03-25 01:59:53 | 10000.01 |
| 2021-03-25 02:00:24 | 10000.01 |
| 2021-03-25 02:00:54 | 10000.01 |
| 2021-03-25 02:01:25 | 10000.01 |
| 2021-03-25 02:01:56 | 10000.01 |
| 2021-03-25 02:02:26 | 10000.01 |
| 2021-03-25 02:02:57 | 10000.01 |
| 2021-03-25 02:03:28 | 10000.01 |
| 2021-03-25 02:03:59 | 10000.01 |
| 2021-03-25 02:04:29 | 10000.01 |
| 2021-03-25 02:05:00 | 10000.01 |
| 2021-03-25 02:05:31 | 10000.01 |
| 2021-03-25 02:06:01 | 10000.01 |
| 2021-03-25 02:06:32 | 10000.01 |
| 2021-03-25 02:07:03 | 10000.01 |
| 2021-03-25 02:07:33 | 10000.01 |
| 2021-03-25 02:08:04 | 10000.01 |
| 2021-03-25 02:08:35 | 10000.01 |
| 2021-03-25 02:09:05 | 10000.01 |
| 2021-03-25 02:09:36 | 10000.01 |
| 2021-03-25 02:10:07 | 10000.01 |
| 2021-03-25 02:10:37 | 10000.01 |
| 2021-03-25 02:11:08 | 10000.01 |
| 2021-03-25 02:11:39 | 10000.01 |
| 2021-03-25 02:12:09 | 10000.01 |
| 2021-03-25 02:12:40 | 10000.01 |
| 2021-03-25 02:13:11 | 10000.01 |
| 2021-03-25 02:13:41 | 10000.01 |
| 2021-03-25 02:14:12 | 10000.01 |
| 2021-03-25 02:14:43 | 10000.01 |
| 2021-03-25 02:15:14 | 10000.01 |
| 2021-03-25 02:15:44 | 10000.01 |
| 2021-03-25 02:16:15 | 10000.01 |
| 2021-03-25 02:16:46 | 10000.01 |
| 2021-03-25 02:17:16 | 10000.01 |
| 2021-03-25 02:17:47 | 10000.01 |
| 2021-03-25 02:18:18 | 10000.01 |
| 2021-03-25 02:18:48 | 10000.01 |
| 2021-03-25 02:19:19 | 10000.01 |
| 2021-03-25 02:19:50 | 10000.01 |
| 2021-03-25 02:20:20 | 10000.01 |
| 2021-03-25 02:20:51 | 10000.01 |
| 2021-03-25 02:21:22 | 10000.01 |
| 2021-03-25 02:21:52 | 10000.01 |
| 2021-03-25 02:22:23 | 10000.01 |
| 2021-03-25 02:22:54 | 10000.01 |
| 2021-03-25 02:23:24 | 10000.01 |
| 2021-03-25 02:23:55 | 10000.01 |
| 2021-03-25 02:24:26 | 10000.01 |
| 2021-03-25 02:24:56 | 10000.01 |
| 2021-03-25 02:25:27 | 10000.01 |
| 2021-03-25 02:25:58 | 10000.01 |
| 2021-03-25 02:26:29 | 10000.01 |
| 2021-03-25 02:26:59 | 10000.01 |
| 2021-03-25 02:27:30 | 10000.01 |
| 2021-03-25 02:28:01 | 10000.01 |
| 2021-03-25 02:28:31 | 10000.01 |
| 2021-03-25 02:29:02 | 10000.01 |
| 2021-03-25 02:29:33 | 10000.01 |
| 2021-03-25 02:30:03 | 10000.01 |
| 2021-03-25 02:30:34 | 10000.01 |
| 2021-03-25 02:31:05 | 10000.01 |
| 2021-03-25 02:31:35 | 10000.01 |
| 2021-03-25 02:32:06 | 10000.01 |
| 2021-03-25 02:32:37 | 10000.01 |
| 2021-03-25 02:33:07 | 10000.01 |
| 2021-03-25 02:33:38 | 10000.01 |
| 2021-03-25 02:34:09 | 10000.01 |
| 2021-03-25 02:34:39 | 10000.01 |
| 2021-03-25 02:35:10 | 10000.01 |
| 2021-03-25 02:35:41 | 10000.01 |
| 2021-03-25 02:36:11 | 10000.01 |
| 2021-03-25 02:36:42 | 10000.01 |
| 2021-03-25 02:37:13 | 10000.01 |
| 2021-03-25 02:37:44 | 10000.01 |
| 2021-03-25 02:38:14 | 10000.01 |
| 2021-03-25 02:38:45 | 10000.01 |
| 2021-03-25 02:39:16 | 10000.01 |
| 2021-03-25 02:39:46 | 10000.01 |
| 2021-03-25 02:40:17 | 10000.01 |
| 2021-03-25 02:40:48 | 10000.01 |
| 2021-03-25 02:41:18 | 10000.01 |
| 2021-03-25 02:41:49 | 10000.01 |
| 2021-03-25 02:42:20 | 10000.01 |
| 2021-03-25 02:42:50 | 10000.01 |
| 2021-03-25 02:43:21 | 10000.01 |
| 2021-03-25 02:43:52 | 10000.01 |
| 2021-03-25 02:44:22 | 10000.01 |
| 2021-03-25 02:44:53 | 10000.01 |
| 2021-03-25 02:45:24 | 10000.01 |
| 2021-03-25 02:45:54 | 10000.01 |
| 2021-03-25 02:46:25 | 10000.01 |
| 2021-03-25 02:46:56 | 10000.01 |
| 2021-03-25 02:47:27 | 10000.01 |
| 2021-03-25 02:47:57 | 10000.01 |
| 2021-03-25 02:48:28 | 10000.01 |
| 2021-03-25 02:48:59 | 10000.01 |
| 2021-03-25 02:49:29 | 10000.01 |
| 2021-03-25 02:50:00 | 10000.01 |
| 2021-03-25 02:50:31 | 10000.01 |
| 2021-03-25 02:51:01 | 10000.01 |
| 2021-03-25 02:51:32 | 10000.01 |
| 2021-03-25 02:52:03 | 10000.01 |
| 2021-03-25 02:52:33 | 10000.01 |
| 2021-03-25 02:53:04 | 10000.01 |
| 2021-03-25 02:53:35 | 10000.01 |
| 2021-03-25 02:54:05 | 10000.01 |
| 2021-03-25 02:54:36 | 10000.01 |
| 2021-03-25 02:55:07 | 10000.01 |
| 2021-03-25 02:55:37 | 10000.01 |
| 2021-03-25 02:56:08 | 10000.01 |
| 2021-03-25 02:56:39 | 10000.01 |
| 2021-03-25 02:57:09 | 10000.01 |
| 2021-03-25 02:57:40 | 10000.01 |
| 2021-03-25 02:58:11 | 10000.01 |
| 2021-03-25 02:58:42 | 10000.01 |
| 2021-03-25 02:59:12 | 10000.01 |
| 2021-03-25 02:59:43 | 10000.01 |
| 2021-03-25 03:00:14 | 10000.01 |
| 2021-03-25 03:00:44 | 10000.01 |
| 2021-03-25 03:01:15 | 10000.01 |
| 2021-03-25 03:01:46 | 10000.01 |
| 2021-03-25 03:02:16 | 10000.01 |
| 2021-03-25 03:02:47 | 10000.01 |
| 2021-03-25 03:03:18 | 10000.01 |
| 2021-03-25 03:03:48 | 10000.01 |
| 2021-03-25 03:04:19 | 10000.01 |
| 2021-03-25 03:04:50 | 10000.01 |
| 2021-03-25 03:05:20 | 10000.01 |
| 2021-03-25 03:05:51 | 10000.01 |
| 2021-03-25 03:06:22 | 10000.01 |
| 2021-03-25 03:06:52 | 10000.01 |
| 2021-03-25 03:07:23 | 10000.01 |
| 2021-03-25 03:07:54 | 10000.01 |
| 2021-03-25 03:08:25 | 10000.01 |
| 2021-03-25 03:08:55 | 10000.01 |
| 2021-03-25 03:09:26 | 10000.01 |
| 2021-03-25 03:09:57 | 10000.01 |
| 2021-03-25 03:10:27 | 10000.01 |
| 2021-03-25 03:10:58 | 10000.01 |
| 2021-03-25 03:11:29 | 10000.01 |
| 2021-03-25 03:11:59 | 10000.01 |
| 2021-03-25 03:12:30 | 10000.01 |
| 2021-03-25 03:13:01 | 10000.01 |
| 2021-03-25 03:13:31 | 10000.01 |
| 2021-03-25 03:14:02 | 10000.01 |
| 2021-03-25 03:14:33 | 10000.01 |
| 2021-03-25 03:15:03 | 10000.01 |
| 2021-03-25 03:15:34 | 10000.01 |
| 2021-03-25 03:16:05 | 10000.01 |
| 2021-03-25 03:16:35 | 10000.01 |
| 2021-03-25 03:17:06 | 10000.01 |
| 2021-03-25 03:17:37 | 10000.01 |
| 2021-03-25 03:18:08 | 10000.01 |
| 2021-03-25 03:18:38 | 10000.01 |
| 2021-03-25 03:19:09 | 10000.01 |
| 2021-03-25 03:19:40 | 10000.01 |
| 2021-03-25 03:20:10 | 10000.01 |
| 2021-03-25 03:20:41 | 10000.01 |
| 2021-03-25 03:21:12 | 10000.01 |
| 2021-03-25 03:21:42 | 10000.01 |
| 2021-03-25 03:22:13 | 10000.01 |
| 2021-03-25 03:22:44 | 10000.01 |
| 2021-03-25 03:23:14 | 10000.01 |
| 2021-03-25 03:23:45 | 10000.01 |
| 2021-03-25 03:24:16 | 10000.01 |
| 2021-03-25 03:24:46 | 10000.01 |
| 2021-03-25 03:25:17 | 10000.01 |
| 2021-03-25 03:25:48 | 10000.01 |
| 2021-03-25 03:26:18 | 10000.01 |
| 2021-03-25 03:26:49 | 10000.01 |
| 2021-03-25 03:27:20 | 10000.01 |
| 2021-03-25 03:27:51 | 10000.01 |
| 2021-03-25 03:28:21 | 10000.01 |
| 2021-03-25 03:28:52 | 10000.01 |
| 2021-03-25 03:29:23 | 10000.01 |
| 2021-03-25 03:29:53 | 10000.01 |
| 2021-03-25 03:30:24 | 10000.01 |
| 2021-03-25 03:30:55 | 10000.01 |
| 2021-03-25 03:31:25 | 10000.01 |
| 2021-03-25 03:31:56 | 10000.01 |
| 2021-03-25 03:32:27 | 10000.01 |
| 2021-03-25 03:32:57 | 10000.01 |
| 2021-03-25 03:33:28 | 10000.01 |
| 2021-03-25 03:33:59 | 10000.01 |
| 2021-03-25 03:34:29 | 10000.01 |
| 2021-03-25 03:35:00 | 10000.01 |
| 2021-03-25 03:35:31 | 10000.01 |
| 2021-03-25 03:36:01 | 10000.01 |
| 2021-03-25 03:36:32 | 10000.01 |
| 2021-03-25 03:37:03 | 10000.01 |
| 2021-03-25 03:37:33 | 10000.01 |
| 2021-03-25 03:38:04 | 10000.01 |
| 2021-03-25 03:38:35 | 10000.01 |
| 2021-03-25 03:39:06 | 10000.01 |
| 2021-03-25 03:39:36 | 10000.01 |
| 2021-03-25 03:40:07 | 10000.01 |
| 2021-03-25 03:40:38 | 10000.01 |
| 2021-03-25 03:41:08 | 10000.01 |
| 2021-03-25 03:41:39 | 10000.01 |
| 2021-03-25 03:42:10 | 10000.01 |
| 2021-03-25 03:42:40 | 10000.01 |
| 2021-03-25 03:43:11 | 10000.01 |
| 2021-03-25 03:43:42 | 10000.01 |
| 2021-03-25 03:44:12 | 10000.01 |
| 2021-03-25 03:44:43 | 10000.01 |
| 2021-03-25 03:45:14 | 10000.01 |
| 2021-03-25 03:45:44 | 10000.01 |
| 2021-03-25 03:46:15 | 10000.01 |
| 2021-03-25 03:46:46 | 10000.01 |
| 2021-03-25 03:47:16 | 10000.01 |
| 2021-03-25 03:47:47 | 10000.01 |
| 2021-03-25 03:48:18 | 10000.01 |
| 2021-03-25 03:48:48 | 10000.01 |
| 2021-03-25 03:49:19 | 10000.01 |
| 2021-03-25 03:49:50 | 10000.01 |
| 2021-03-25 03:50:20 | 10000.01 |
| 2021-03-25 03:50:51 | 10000.01 |
| 2021-03-25 03:51:22 | 10000.01 |
| 2021-03-25 03:51:53 | 10000.01 |
| 2021-03-25 03:52:23 | 10000.01 |
| 2021-03-25 03:52:54 | 10000.01 |
| 2021-03-25 03:53:25 | 10000.01 |
| 2021-03-25 03:53:55 | 10000.01 |
| 2021-03-25 03:54:26 | 10000.01 |
| 2021-03-25 03:54:57 | 10000.01 |
| 2021-03-25 03:55:27 | 10000.01 |
| 2021-03-25 03:55:58 | 10000.01 |
| 2021-03-25 03:56:29 | 10000.01 |
| 2021-03-25 03:56:59 | 10000.01 |
| 2021-03-25 03:57:30 | 10000.01 |
| 2021-03-25 03:58:01 | 10000.01 |
| 2021-03-25 03:58:31 | 10000.01 |
| 2021-03-25 03:59:02 | 10000.01 |
| 2021-03-25 03:59:33 | 10000.01 |
| 2021-03-25 04:00:03 | 10000.01 |
| 2021-03-25 04:00:34 | 10000.01 |
| 2021-03-25 04:01:05 | 10000.01 |
| 2021-03-25 04:01:35 | 10000.01 |
| 2021-03-25 04:02:06 | 10000.01 |
| 2021-03-25 04:02:37 | 10000.01 |
| 2021-03-25 04:03:07 | 10000.01 |
| 2021-03-25 04:03:38 | 10000.01 |
| 2021-03-25 04:04:09 | 10000.01 |
| 2021-03-25 04:04:40 | 10000.01 |
| 2021-03-25 04:05:10 | 10000.01 |
| 2021-03-25 04:05:41 | 10000.01 |
| 2021-03-25 04:06:12 | 10000.01 |
| 2021-03-25 04:06:42 | 10000.01 |
| 2021-03-25 04:07:13 | 10000.01 |
| 2021-03-25 04:07:44 | 10000.01 |
| 2021-03-25 04:08:14 | 10000.01 |
| 2021-03-25 04:08:45 | 10000.01 |
| 2021-03-25 04:09:16 | 10000.01 |
| 2021-03-25 04:09:46 | 10000.01 |
| 2021-03-25 04:10:17 | 10000.01 |
| 2021-03-25 04:10:48 | 10000.01 |
| 2021-03-25 04:11:18 | 10000.01 |
| 2021-03-25 04:11:49 | 10000.01 |
| 2021-03-25 04:12:20 | 10000.01 |
| 2021-03-25 04:12:50 | 10000.01 |
| 2021-03-25 04:13:21 | 10000.01 |
| 2021-03-25 04:13:52 | 10000.01 |
| 2021-03-25 04:14:23 | 10000.01 |
| 2021-03-25 04:14:53 | 10000.01 |
| 2021-03-25 04:15:24 | 10000.01 |
| 2021-03-25 04:15:55 | 10000.01 |
| 2021-03-25 04:16:25 | 10000.01 |
| 2021-03-25 04:16:56 | 10000.01 |
| 2021-03-25 04:17:27 | 10000.01 |
| 2021-03-25 04:17:57 | 10000.01 |
| 2021-03-25 04:18:28 | 10000.01 |
| 2021-03-25 04:18:59 | 10000.01 |
| 2021-03-25 04:19:29 | 10000.01 |
| 2021-03-25 04:20:00 | 10000.01 |
| 2021-03-25 04:20:31 | 10000.01 |
| 2021-03-25 04:21:01 | 10000.01 |
| 2021-03-25 04:21:32 | 10000.01 |
| 2021-03-25 04:22:03 | 10000.01 |
| 2021-03-25 04:22:33 | 10000.01 |
| 2021-03-25 04:23:04 | 10000.01 |
| 2021-03-25 04:23:35 | 10000.01 |
| 2021-03-25 04:24:05 | 10000.01 |
| 2021-03-25 04:24:36 | 10000.01 |
| 2021-03-25 04:25:07 | 10000.01 |
| 2021-03-25 04:25:37 | 10000.01 |
| 2021-03-25 04:26:08 | 10000.01 |
| 2021-03-25 04:26:39 | 10000.01 |
| 2021-03-25 04:27:10 | 10000.01 |
| 2021-03-25 04:27:40 | 10000.01 |
| 2021-03-25 04:28:11 | 10000.01 |
| 2021-03-25 04:28:42 | 10000.01 |
| 2021-03-25 04:29:12 | 10000.01 |
| 2021-03-25 04:29:43 | 10000.01 |
| 2021-03-25 04:30:14 | 10000.01 |
| 2021-03-25 04:30:44 | 10000.01 |
| 2021-03-25 04:31:15 | 10000.01 |
| 2021-03-25 04:31:46 | 10000.01 |
| 2021-03-25 04:32:16 | 10000.01 |
| 2021-03-25 04:32:47 | 10000.01 |
| 2021-03-25 04:33:18 | 10000.01 |
| 2021-03-25 04:33:48 | 10000.01 |
| 2021-03-25 04:34:19 | 10000.01 |
| 2021-03-25 04:34:50 | 10000.01 |
| 2021-03-25 04:35:20 | 10000.01 |
| 2021-03-25 04:35:51 | 10000.01 |
| 2021-03-25 04:36:22 | 10000.01 |
| 2021-03-25 04:36:53 | 10000.01 |
| 2021-03-25 04:37:23 | 10000.01 |
| 2021-03-25 04:37:54 | 10000.01 |
| 2021-03-25 04:38:25 | 10000.01 |
| 2021-03-25 04:38:55 | 10000.01 |
| 2021-03-25 04:39:26 | 10000.01 |
| 2021-03-25 04:39:57 | 10000.01 |
| 2021-03-25 04:40:27 | 10000.01 |
| 2021-03-25 04:40:58 | 10000.01 |
| 2021-03-25 04:41:29 | 10000.01 |
| 2021-03-25 04:41:59 | 10000.01 |
| 2021-03-25 04:42:30 | 10000.01 |
| 2021-03-25 04:43:01 | 10000.01 |
| 2021-03-25 04:43:31 | 10000.01 |
| 2021-03-25 04:44:02 | 10000.01 |
| 2021-03-25 04:44:33 | 10000.01 |
| 2021-03-25 04:45:03 | 10000.01 |
| 2021-03-25 04:45:34 | 10000.01 |
| 2021-03-25 04:46:05 | 10000.01 |
| 2021-03-25 04:46:35 | 10000.01 |
| 2021-03-25 04:47:06 | 10000.01 |
| 2021-03-25 04:47:37 | 10000.01 |
| 2021-03-25 04:48:08 | 10000.01 |
| 2021-03-25 04:48:38 | 10000.01 |
| 2021-03-25 04:49:09 | 10000.01 |
| 2021-03-25 04:49:40 | 10000.01 |
| 2021-03-25 04:50:10 | 10000.01 |
| 2021-03-25 04:50:41 | 10000.01 |
| 2021-03-25 04:51:12 | 10000.01 |
| 2021-03-25 04:51:42 | 10000.01 |
| 2021-03-25 04:52:13 | 10000.011 |
| 2021-03-25 04:52:44 | 10000.011 |
| 2021-03-25 04:53:14 | 10000.011 |
| 2021-03-25 04:53:45 | 10000.011 |
| 2021-03-25 04:54:16 | 10000.011 |
| 2021-03-25 04:54:46 | 10000.011 |
| 2021-03-25 04:55:17 | 10000.011 |
| 2021-03-25 04:55:48 | 10000.011 |
| 2021-03-25 04:56:18 | 10000.01 |
| 2021-03-25 04:56:49 | 10000.01 |
| 2021-03-25 04:57:20 | 10000.01 |
| 2021-03-25 04:57:50 | 10000.01 |
| 2021-03-25 04:58:21 | 10000.01 |
| 2021-03-25 04:58:52 | 10000.01 |
| 2021-03-25 04:59:23 | 10000.01 |
| 2021-03-25 04:59:53 | 10000.01 |
| 2021-03-25 05:00:24 | 10000.01 |
| 2021-03-25 05:00:55 | 10000.01 |
| 2021-03-25 05:01:25 | 10000.01 |
| 2021-03-25 05:01:56 | 10000.01 |
| 2021-03-25 05:02:27 | 10000.01 |
| 2021-03-25 05:02:57 | 10000.01 |
| 2021-03-25 05:03:28 | 10000.01 |
| 2021-03-25 05:03:59 | 10000.01 |
| 2021-03-25 05:04:29 | 10000.01 |
| 2021-03-25 05:05:00 | 10000.01 |
| 2021-03-25 05:05:31 | 10000.01 |
| 2021-03-25 05:06:01 | 10000.01 |
| 2021-03-25 05:06:32 | 10000.01 |
| 2021-03-25 05:07:03 | 10000.01 |
| 2021-03-25 05:07:33 | 10000.01 |
| 2021-03-25 05:08:04 | 10000.01 |
| 2021-03-25 05:08:35 | 10000.01 |
| 2021-03-25 05:09:05 | 10000.01 |
| 2021-03-25 05:09:36 | 10000.01 |
| 2021-03-25 05:10:07 | 10000.01 |
| 2021-03-25 05:10:38 | 10000.01 |
| 2021-03-25 05:11:08 | 10000.01 |
| 2021-03-25 05:11:39 | 10000.01 |
| 2021-03-25 05:12:10 | 10000.01 |
| 2021-03-25 05:12:40 | 10000.01 |
| 2021-03-25 05:13:11 | 10000.01 |
| 2021-03-25 05:13:42 | 10000.01 |
| 2021-03-25 05:14:12 | 10000.01 |
| 2021-03-25 05:14:43 | 10000.01 |
| 2021-03-25 05:15:14 | 10000.01 |
| 2021-03-25 05:15:44 | 10000.01 |
| 2021-03-25 05:16:15 | 10000.01 |
| 2021-03-25 05:16:46 | 10000.01 |
| 2021-03-25 05:17:16 | 10000.01 |
| 2021-03-25 05:17:47 | 10000.01 |
| 2021-03-25 05:18:18 | 10000.01 |
| 2021-03-25 05:18:48 | 10000.01 |
| 2021-03-25 05:19:19 | 10000.01 |
| 2021-03-25 05:19:50 | 10000.01 |
| 2021-03-25 05:20:20 | 10000.01 |
| 2021-03-25 05:20:51 | 10000.01 |
| 2021-03-25 05:21:22 | 10000.01 |
| 2021-03-25 05:21:53 | 10000.01 |
| 2021-03-25 05:22:23 | 10000.01 |
| 2021-03-25 05:22:54 | 10000.01 |
| 2021-03-25 05:23:25 | 10000.01 |
| 2021-03-25 05:23:55 | 10000.01 |
| 2021-03-25 05:24:26 | 10000.01 |
| 2021-03-25 05:24:57 | 10000.01 |
| 2021-03-25 05:25:27 | 10000.01 |
| 2021-03-25 05:25:58 | 10000.01 |
| 2021-03-25 05:26:29 | 10000.01 |
| 2021-03-25 05:26:59 | 10000.01 |
| 2021-03-25 05:27:30 | 10000.01 |
| 2021-03-25 05:28:01 | 10000.01 |
| 2021-03-25 05:28:31 | 10000.01 |
| 2021-03-25 05:29:02 | 10000.01 |
| 2021-03-25 05:29:33 | 10000.01 |
| 2021-03-25 05:30:03 | 10000.01 |
| 2021-03-25 05:30:34 | 10000.01 |
| 2021-03-25 05:31:05 | 10000.01 |
| 2021-03-25 05:31:35 | 10000.01 |
| 2021-03-25 05:32:06 | 10000.01 |
| 2021-03-25 05:32:37 | 10000.01 |
| 2021-03-25 05:33:08 | 10000.01 |
| 2021-03-25 05:33:38 | 10000.01 |
| 2021-03-25 05:34:09 | 10000.01 |
| 2021-03-25 05:34:40 | 10000.01 |
| 2021-03-25 05:35:10 | 10000.01 |
| 2021-03-25 05:35:41 | 10000.01 |
| 2021-03-25 05:36:12 | 10000.01 |
| 2021-03-25 05:36:42 | 10000.01 |
| 2021-03-25 05:37:13 | 10000.01 |
| 2021-03-25 05:37:44 | 10000.01 |
| 2021-03-25 05:38:14 | 10000.01 |
| 2021-03-25 05:38:45 | 10000.01 |
| 2021-03-25 05:39:16 | 10000.01 |
| 2021-03-25 05:39:46 | 10000.01 |
| 2021-03-25 05:40:17 | 10000.01 |
| 2021-03-25 05:40:48 | 10000.01 |
| 2021-03-25 05:41:18 | 10000.01 |
| 2021-03-25 05:41:49 | 10000.01 |
| 2021-03-25 05:42:20 | 10000.01 |
| 2021-03-25 05:42:50 | 10000.01 |
| 2021-03-25 05:43:21 | 10000.01 |
| 2021-03-25 05:43:52 | 10000.01 |
| 2021-03-25 05:44:22 | 10000.01 |
| 2021-03-25 05:44:53 | 10000.01 |
| 2021-03-25 05:45:24 | 10000.01 |
| 2021-03-25 05:45:55 | 10000.01 |
| 2021-03-25 05:46:25 | 10000.01 |
| 2021-03-25 05:46:56 | 10000.01 |
| 2021-03-25 05:47:27 | 10000.01 |
| 2021-03-25 05:47:57 | 10000.01 |
| 2021-03-25 05:48:28 | 10000.01 |
| 2021-03-25 05:48:59 | 10000.01 |
| 2021-03-25 05:49:29 | 10000.01 |
| 2021-03-25 05:50:00 | 10000.01 |
| 2021-03-25 05:50:31 | 10000.01 |
| 2021-03-25 05:51:01 | 10000.01 |
| 2021-03-25 05:51:32 | 10000.01 |
| 2021-03-25 05:52:03 | 10000.01 |
| 2021-03-25 05:52:33 | 10000.01 |
| 2021-03-25 05:53:04 | 10000.01 |
| 2021-03-25 05:53:35 | 10000.01 |
| 2021-03-25 05:54:05 | 10000.01 |
| 2021-03-25 05:54:36 | 10000.01 |
| 2021-03-25 05:55:07 | 10000.01 |
| 2021-03-25 05:55:37 | 10000.01 |
| 2021-03-25 05:56:08 | 10000.01 |
| 2021-03-25 05:56:39 | 10000.01 |
| 2021-03-25 05:57:09 | 10000.01 |
| 2021-03-25 05:57:40 | 10000.01 |
| 2021-03-25 05:58:11 | 10000.01 |
| 2021-03-25 05:58:42 | 10000.01 |
| 2021-03-25 05:59:12 | 10000.01 |
| 2021-03-25 05:59:43 | 10000.01 |
| 2021-03-25 06:00:14 | 10000.01 |
| 2021-03-25 06:00:44 | 10000.01 |
| 2021-03-25 06:01:15 | 10000.01 |
| 2021-03-25 06:01:46 | 10000.01 |
| 2021-03-25 06:02:16 | 10000.01 |
| 2021-03-25 06:02:47 | 10000.01 |
| 2021-03-25 06:03:18 | 10000.01 |
| 2021-03-25 06:03:48 | 10000.01 |
| 2021-03-25 06:04:19 | 10000.01 |
| 2021-03-25 06:04:50 | 10000.01 |
| 2021-03-25 06:05:20 | 10000.01 |
| 2021-03-25 06:05:51 | 10000.01 |
| 2021-03-25 06:06:22 | 10000.01 |
| 2021-03-25 06:06:52 | 10000.01 |
| 2021-03-25 06:07:23 | 10000.01 |
| 2021-03-25 06:07:54 | 10000.01 |
| 2021-03-25 06:08:24 | 10000.01 |
| 2021-03-25 06:08:55 | 10000.01 |
| 2021-03-25 06:09:26 | 10000.01 |
| 2021-03-25 06:09:57 | 10000.01 |
| 2021-03-25 06:10:27 | 10000.01 |
| 2021-03-25 06:10:58 | 10000.01 |
| 2021-03-25 06:11:29 | 10000.01 |
| 2021-03-25 06:11:59 | 10000.01 |
| 2021-03-25 06:12:30 | 10000.01 |
| 2021-03-25 06:13:01 | 10000.01 |
| 2021-03-25 06:13:31 | 10000.01 |
| 2021-03-25 06:14:02 | 10000.01 |
| 2021-03-25 06:14:33 | 10000.01 |
| 2021-03-25 06:15:03 | 10000.01 |
| 2021-03-25 06:15:34 | 10000.01 |
| 2021-03-25 06:16:05 | 10000.01 |
| 2021-03-25 06:16:35 | 10000.01 |
| 2021-03-25 06:17:06 | 10000.01 |
| 2021-03-25 06:17:37 | 10000.01 |
| 2021-03-25 06:18:07 | 10000.01 |
| 2021-03-25 06:18:38 | 10000.01 |
| 2021-03-25 06:19:09 | 10000.01 |
| 2021-03-25 06:19:39 | 10000.01 |
| 2021-03-25 06:20:10 | 10000.01 |
| 2021-03-25 06:20:41 | 10000.01 |
| 2021-03-25 06:21:12 | 10000.01 |
| 2021-03-25 06:21:42 | 10000.01 |
| 2021-03-25 06:22:13 | 10000.01 |
| 2021-03-25 06:22:44 | 10000.01 |
| 2021-03-25 06:23:14 | 10000.01 |
| 2021-03-25 06:23:45 | 10000.01 |
| 2021-03-25 06:24:16 | 10000.01 |
| 2021-03-25 06:24:46 | 10000.01 |
| 2021-03-25 06:25:17 | 10000.01 |
| 2021-03-25 06:25:48 | 10000.01 |
| 2021-03-25 06:26:18 | 10000.01 |
| 2021-03-25 06:26:49 | 10000.01 |
| 2021-03-25 06:27:20 | 10000.01 |
| 2021-03-25 06:27:50 | 10000.01 |
| 2021-03-25 06:28:21 | 10000.01 |
| 2021-03-25 06:28:52 | 10000.01 |
| 2021-03-25 06:29:22 | 10000.01 |
| 2021-03-25 06:29:53 | 10000.01 |
| 2021-03-25 06:30:24 | 10000.01 |
| 2021-03-25 06:30:54 | 10000.01 |
| 2021-03-25 06:31:25 | 10000.01 |
| 2021-03-25 06:31:56 | 10000.01 |
| 2021-03-25 06:32:27 | 10000.01 |
| 2021-03-25 06:32:57 | 10000.01 |
| 2021-03-25 06:33:28 | 10000.01 |
| 2021-03-25 06:33:59 | 10000.01 |
| 2021-03-25 06:34:29 | 10000.01 |
| 2021-03-25 06:35:00 | 10000.01 |
| 2021-03-25 06:35:31 | 10000.01 |
| 2021-03-25 06:36:01 | 10000.01 |
| 2021-03-25 06:36:32 | 10000.01 |
| 2021-03-25 06:37:03 | 10000.01 |
| 2021-03-25 06:37:33 | 10000.01 |
| 2021-03-25 06:38:04 | 10000.01 |
| 2021-03-25 06:38:35 | 10000.01 |
| 2021-03-25 06:39:05 | 10000.01 |
| 2021-03-25 06:39:36 | 10000.01 |
| 2021-03-25 06:40:07 | 10000.01 |
| 2021-03-25 06:40:37 | 10000.01 |
| 2021-03-25 06:41:08 | 10000.01 |
| 2021-03-25 06:41:39 | 10000.01 |
| 2021-03-25 06:42:09 | 10000.01 |
| 2021-03-25 06:42:40 | 10000.01 |
| 2021-03-25 06:43:11 | 10000.01 |
| 2021-03-25 06:43:42 | 10000.01 |
| 2021-03-25 06:44:12 | 10000.01 |
| 2021-03-25 06:44:43 | 10000.01 |
| 2021-03-25 06:45:14 | 10000.01 |
| 2021-03-25 06:45:44 | 10000.01 |
| 2021-03-25 06:46:15 | 10000.01 |
| 2021-03-25 06:46:46 | 10000.01 |
| 2021-03-25 06:47:16 | 10000.01 |
| 2021-03-25 06:47:47 | 10000.01 |
| 2021-03-25 06:48:18 | 10000.01 |
| 2021-03-25 06:48:48 | 10000.01 |
| 2021-03-25 06:49:19 | 10000.01 |
| 2021-03-25 06:49:50 | 10000.01 |
| 2021-03-25 06:50:20 | 10000.01 |
| 2021-03-25 06:50:51 | 10000.01 |
| 2021-03-25 06:51:22 | 10000.01 |
| 2021-03-25 06:51:52 | 10000.01 |
| 2021-03-25 06:52:23 | 10000.01 |
| 2021-03-25 06:52:54 | 10000.01 |
| 2021-03-25 06:53:24 | 10000.01 |
| 2021-03-25 06:53:55 | 10000.01 |
| 2021-03-25 06:54:26 | 10000.01 |
| 2021-03-25 06:54:57 | 10000.01 |
| 2021-03-25 06:55:27 | 10000.01 |
| 2021-03-25 06:55:58 | 10000.01 |
| 2021-03-25 06:56:29 | 10000.01 |
| 2021-03-25 06:56:59 | 10000.01 |
| 2021-03-25 06:57:30 | 10000.01 |
| 2021-03-25 06:58:01 | 10000.01 |
| 2021-03-25 06:58:31 | 10000.01 |
| 2021-03-25 06:59:02 | 10000.01 |
| 2021-03-25 06:59:33 | 10000.01 |
| 2021-03-25 07:00:03 | 10000.01 |
| 2021-03-25 07:00:34 | 10000.01 |
| 2021-03-25 07:01:05 | 10000.01 |
| 2021-03-25 07:01:35 | 10000.01 |
| 2021-03-25 07:02:06 | 10000.01 |
| 2021-03-25 07:02:37 | 10000.01 |
| 2021-03-25 07:03:07 | 10000.01 |
| 2021-03-25 07:03:38 | 10000.01 |
| 2021-03-25 07:04:09 | 10000.01 |
| 2021-03-25 07:04:39 | 10000.01 |
| 2021-03-25 07:05:10 | 10000.01 |
| 2021-03-25 07:05:41 | 10000.01 |
| 2021-03-25 07:06:12 | 10000.01 |
| 2021-03-25 07:06:42 | 10000.01 |
| 2021-03-25 07:07:13 | 10000.01 |
| 2021-03-25 07:07:44 | 10000.01 |
| 2021-03-25 07:08:14 | 10000.01 |
| 2021-03-25 07:08:45 | 10000.01 |
| 2021-03-25 07:09:16 | 10000.01 |
| 2021-03-25 07:09:46 | 10000.01 |
| 2021-03-25 07:10:17 | 10000.01 |
| 2021-03-25 07:10:48 | 10000.01 |
| 2021-03-25 07:11:18 | 10000.01 |
| 2021-03-25 07:11:49 | 10000.01 |
| 2021-03-25 07:12:20 | 10000.01 |
| 2021-03-25 07:12:50 | 10000.01 |
| 2021-03-25 07:13:21 | 10000.01 |
| 2021-03-25 07:13:52 | 10000.01 |
| 2021-03-25 07:14:22 | 10000.01 |
| 2021-03-25 07:14:53 | 10000.01 |
| 2021-03-25 07:15:24 | 10000.01 |
| 2021-03-25 07:15:54 | 10000.01 |
| 2021-03-25 07:16:25 | 10000.01 |
| 2021-03-25 07:16:56 | 10000.01 |
| 2021-03-25 07:17:27 | 10000.01 |
| 2021-03-25 07:17:57 | 10000.01 |
| 2021-03-25 07:18:28 | 10000.01 |
| 2021-03-25 07:18:59 | 10000.01 |
| 2021-03-25 07:19:29 | 10000.01 |
| 2021-03-25 07:20:00 | 10000.01 |
| 2021-03-25 07:20:31 | 10000.01 |
| 2021-03-25 07:21:01 | 10000.01 |
| 2021-03-25 07:21:32 | 10000.01 |
| 2021-03-25 07:22:03 | 10000.01 |
| 2021-03-25 07:22:33 | 10000.01 |
| 2021-03-25 07:23:04 | 10000.01 |
| 2021-03-25 07:23:35 | 10000.011 |
| 2021-03-25 07:24:05 | 10000.011 |
| 2021-03-25 07:24:36 | 10000.011 |
| 2021-03-25 07:25:07 | 10000.011 |
| 2021-03-25 07:25:37 | 10000.011 |
| 2021-03-25 07:26:08 | 10000.011 |
| 2021-03-25 07:26:39 | 10000.01 |
| 2021-03-25 07:27:10 | 10000.01 |
| 2021-03-25 07:27:40 | 10000.01 |
| 2021-03-25 07:28:11 | 10000.01 |
| 2021-03-25 07:28:42 | 10000.01 |
| 2021-03-25 07:29:12 | 10000.01 |
| 2021-03-25 07:29:43 | 10000.01 |
| 2021-03-25 07:30:14 | 10000.01 |
| 2021-03-25 07:30:44 | 10000.01 |
| 2021-03-25 07:31:15 | 10000.01 |
| 2021-03-25 07:31:46 | 10000.01 |
| 2021-03-25 07:32:16 | 10000.01 |
| 2021-03-25 07:32:47 | 10000.01 |
| 2021-03-25 07:33:18 | 10000.01 |
| 2021-03-25 07:33:48 | 10000.01 |
| 2021-03-25 07:34:19 | 10000.01 |
| 2021-03-25 07:34:50 | 10000.01 |
| 2021-03-25 07:35:20 | 10000.01 |
| 2021-03-25 07:35:51 | 10000.01 |
| 2021-03-25 07:36:22 | 10000.01 |
| 2021-03-25 07:36:53 | 10000.01 |
| 2021-03-25 07:37:23 | 10000.01 |
| 2021-03-25 07:37:54 | 10000.01 |
| 2021-03-25 07:38:25 | 10000.01 |
| 2021-03-25 07:38:55 | 10000.01 |
| 2021-03-25 07:39:26 | 10000.01 |
| 2021-03-25 07:39:57 | 10000.01 |
| 2021-03-25 07:40:27 | 10000.01 |
| 2021-03-25 07:40:58 | 10000.01 |
| 2021-03-25 07:41:29 | 10000.01 |
| 2021-03-25 07:41:59 | 10000.01 |
| 2021-03-25 07:42:30 | 10000.01 |
| 2021-03-25 07:43:01 | 10000.01 |
| 2021-03-25 07:43:31 | 10000.01 |
| 2021-03-25 07:44:02 | 10000.01 |
| 2021-03-25 07:44:33 | 10000.01 |
| 2021-03-25 07:45:03 | 10000.01 |
| 2021-03-25 07:45:34 | 10000.01 |
| 2021-03-25 07:46:05 | 10000.01 |
| 2021-03-25 07:46:35 | 10000.01 |
| 2021-03-25 07:47:06 | 10000.01 |
| 2021-03-25 07:47:37 | 10000.01 |
| 2021-03-25 07:48:08 | 10000.01 |
| 2021-03-25 07:48:38 | 10000.01 |
| 2021-03-25 07:49:09 | 10000.01 |
| 2021-03-25 07:49:40 | 10000.01 |
| 2021-03-25 07:50:10 | 10000.01 |
| 2021-03-25 07:50:41 | 10000.01 |
| 2021-03-25 07:51:12 | 10000.01 |
| 2021-03-25 07:51:42 | 10000.01 |
| 2021-03-25 07:52:13 | 10000.01 |
| 2021-03-25 07:52:44 | 10000.01 |
| 2021-03-25 07:53:14 | 10000.01 |
| 2021-03-25 07:53:45 | 10000.01 |
| 2021-03-25 07:54:16 | 10000.01 |
| 2021-03-25 07:54:46 | 10000.01 |
| 2021-03-25 07:55:17 | 10000.01 |
| 2021-03-25 07:55:48 | 10000.01 |
| 2021-03-25 07:56:18 | 10000.01 |
| 2021-03-25 07:56:49 | 10000.01 |
| 2021-03-25 07:57:20 | 10000.01 |
| 2021-03-25 07:57:51 | 10000.01 |
| 2021-03-25 07:58:21 | 10000.01 |
| 2021-03-25 07:58:52 | 10000.01 |
| 2021-03-25 07:59:23 | 10000.01 |
| 2021-03-25 07:59:53 | 10000.01 |
| 2021-03-25 08:00:24 | 10000.01 |
| 2021-03-25 08:00:55 | 10000.01 |
| 2021-03-25 08:01:25 | 10000.01 |
| 2021-03-25 08:01:56 | 10000.01 |
| 2021-03-25 08:02:27 | 10000.01 |
| 2021-03-25 08:02:57 | 10000.01 |
| 2021-03-25 08:03:28 | 10000.01 |
| 2021-03-25 08:03:59 | 10000.01 |
| 2021-03-25 08:04:29 | 10000.01 |
| 2021-03-25 08:05:00 | 10000.01 |
| 2021-03-25 08:05:31 | 10000.01 |
| 2021-03-25 08:06:01 | 10000.01 |
| 2021-03-25 08:06:32 | 10000.01 |
| 2021-03-25 08:07:03 | 10000.01 |
| 2021-03-25 08:07:33 | 10000.01 |
| 2021-03-25 08:08:04 | 10000.01 |
| 2021-03-25 08:08:35 | 10000.01 |
| 2021-03-25 08:09:06 | 10000.01 |
| 2021-03-25 08:09:36 | 10000.01 |
| 2021-03-25 08:10:07 | 10000.01 |
| 2021-03-25 08:10:38 | 10000.01 |
| 2021-03-25 08:11:08 | 10000.01 |
| 2021-03-25 08:11:39 | 10000.01 |
| 2021-03-25 08:12:10 | 10000.01 |
| 2021-03-25 08:12:40 | 10000.01 |
| 2021-03-25 08:13:11 | 10000.01 |
| 2021-03-25 08:13:42 | 10000.01 |
| 2021-03-25 08:14:12 | 10000.01 |
| 2021-03-25 08:14:43 | 10000.01 |
| 2021-03-25 08:15:14 | 10000.01 |
| 2021-03-25 08:15:44 | 10000.01 |